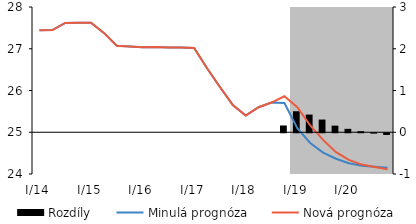
| Category | Rozdíly |
|---|---|
| 0 | 0 |
| 1 | 0 |
| 2 | 0 |
| 3 | 0 |
| 4 | 0 |
| 5 | 0 |
| 6 | 0 |
| 7 | 0 |
| 8 | 0 |
| 9 | 0 |
| 10 | 0 |
| 11 | 0 |
| 12 | 0 |
| 13 | 0 |
| 14 | 0 |
| 15 | 0 |
| 16 | 0 |
| 17 | 0 |
| 18 | 0 |
| 19 | 0.162 |
| 20 | 0.503 |
| 21 | 0.423 |
| 22 | 0.304 |
| 23 | 0.158 |
| 24 | 0.081 |
| 25 | 0.026 |
| 26 | -0.009 |
| 27 | -0.041 |